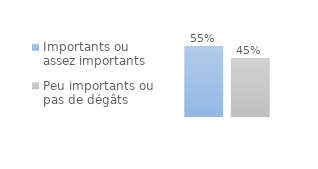
| Category | Importants ou assez importants | Peu importants ou pas de dégâts |
|---|---|---|
| 0 | 0.546 | 0.454 |